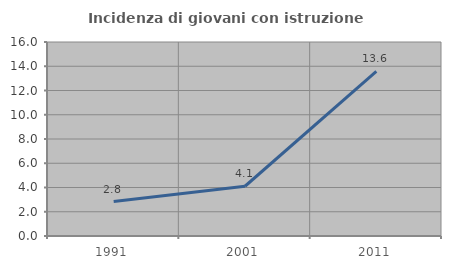
| Category | Incidenza di giovani con istruzione universitaria |
|---|---|
| 1991.0 | 2.837 |
| 2001.0 | 4.103 |
| 2011.0 | 13.571 |